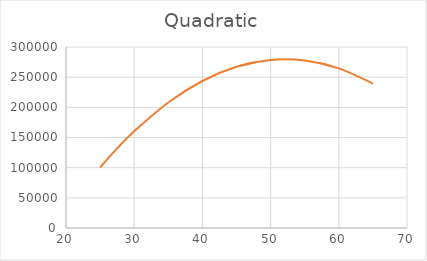
| Category | Quadratic |
|---|---|
| 25.0 | 100202.683 |
| 27.0 | 125655.003 |
| 30.0 | 160184.154 |
| 35.0 | 208001.194 |
| 40.0 | 243653.805 |
| 45.0 | 267141.987 |
| 50.0 | 278465.739 |
| 55.0 | 277625.062 |
| 60.0 | 264619.955 |
| 65.0 | 239450.418 |